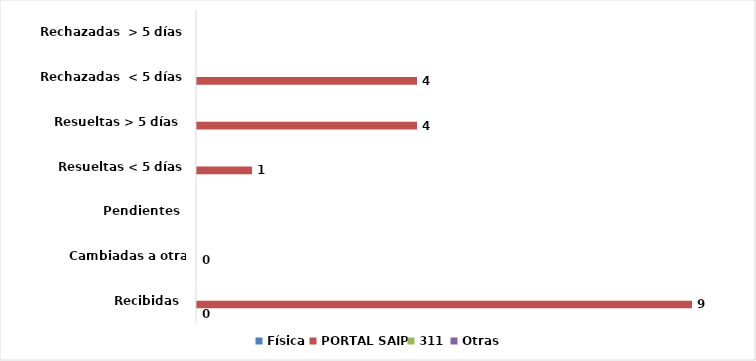
| Category | Física | PORTAL SAIP | 311 | Otras |
|---|---|---|---|---|
| Recibidas  | 0 | 9 | 0 | 0 |
| Cambiadas a otra institución | 0 | 0 | 0 | 0 |
| Pendientes  | 0 | 0 | 0 | 0 |
| Resueltas < 5 días | 0 | 1 | 0 | 0 |
| Resueltas > 5 días  | 0 | 4 | 0 | 0 |
| Rechazadas  < 5 días | 0 | 4 | 0 | 0 |
| Rechazadas  > 5 días | 0 | 0 | 0 | 0 |